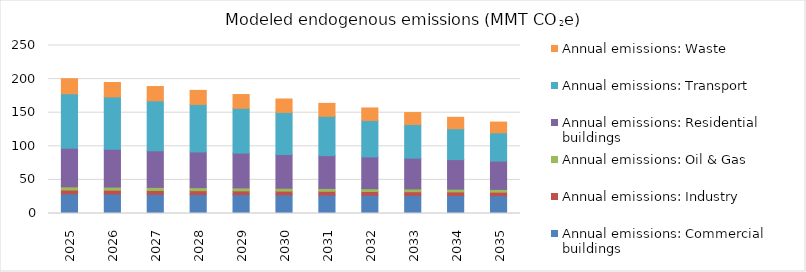
| Category | Annual emissions: Commercial buildings | Annual emissions: Industry | Annual emissions: Oil & Gas | Annual emissions: Residential buildings | Annual emissions: Transport | Annual emissions: Waste |
|---|---|---|---|---|---|---|
| 2025.0 | 29.229 | 5.783 | 4.639 | 57.366 | 81.195 | 22.368 |
| 2026.0 | 28.991 | 5.759 | 4.579 | 56.274 | 77.87 | 21.452 |
| 2027.0 | 28.586 | 5.733 | 4.519 | 54.482 | 74.346 | 21.249 |
| 2028.0 | 28.309 | 5.704 | 4.459 | 53.11 | 70.664 | 20.937 |
| 2029.0 | 28.034 | 5.671 | 4.398 | 51.69 | 66.72 | 20.511 |
| 2030.0 | 27.699 | 5.629 | 4.338 | 50.145 | 62.617 | 19.971 |
| 2031.0 | 27.458 | 5.592 | 4.277 | 48.777 | 58.448 | 19.33 |
| 2032.0 | 27.195 | 5.548 | 4.217 | 47.256 | 54.249 | 18.608 |
| 2033.0 | 26.953 | 5.496 | 4.156 | 45.709 | 50.095 | 17.788 |
| 2034.0 | 26.71 | 5.433 | 4.095 | 43.994 | 46.016 | 16.905 |
| 2035.0 | 26.454 | 5.352 | 4.034 | 42.2 | 42.06 | 15.973 |